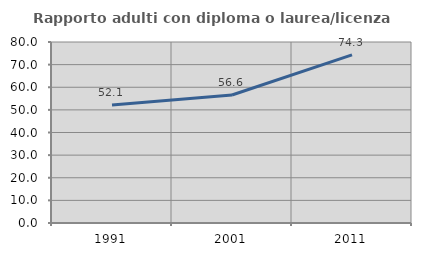
| Category | Rapporto adulti con diploma o laurea/licenza media  |
|---|---|
| 1991.0 | 52.113 |
| 2001.0 | 56.585 |
| 2011.0 | 74.302 |